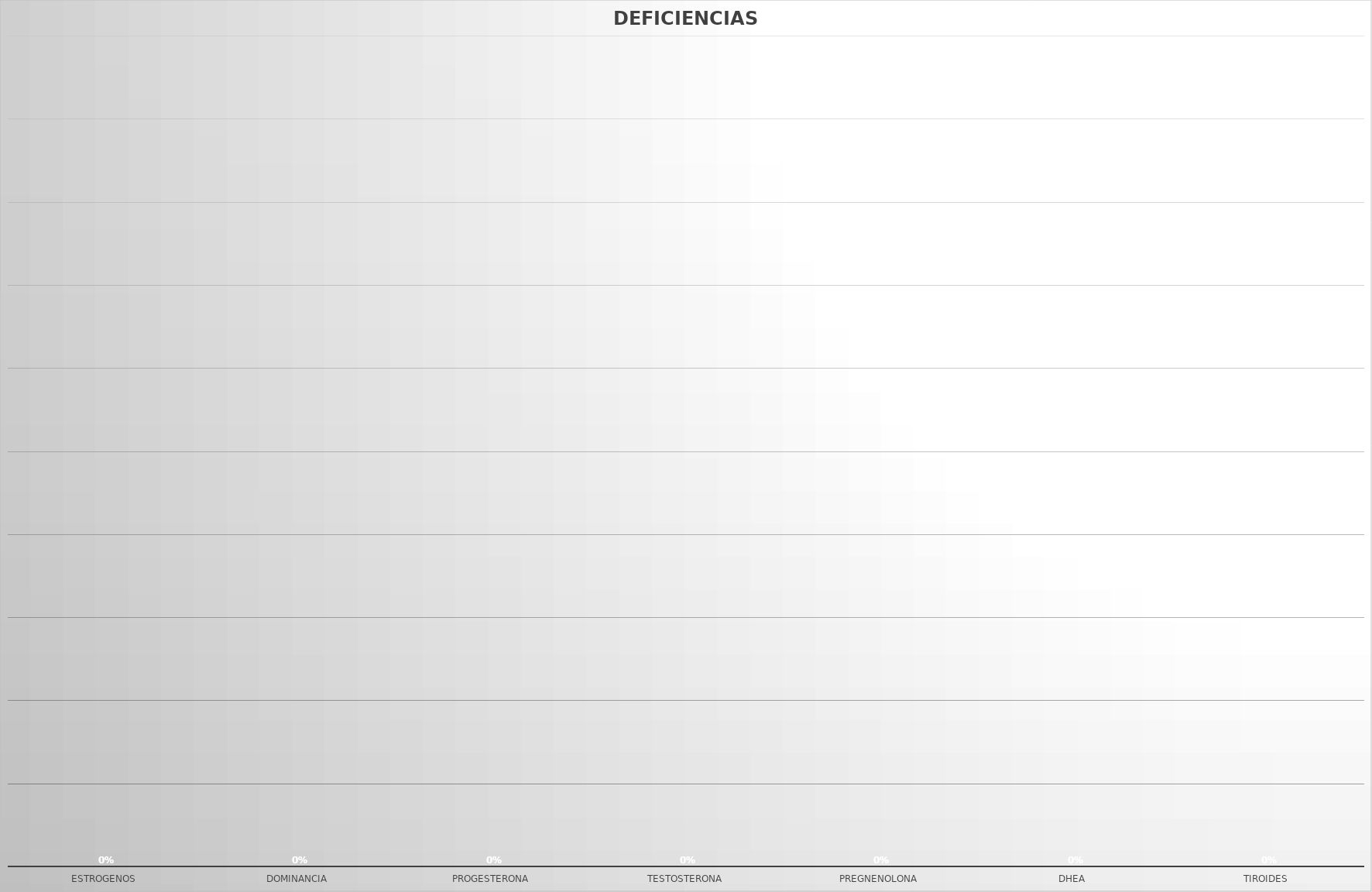
| Category | Series 0 |
|---|---|
| ESTROGENOS | 0 |
| DOMINANCIA | 0 |
| PROGESTERONA | 0 |
| TESTOSTERONA | 0 |
| PREGNENOLONA | 0 |
| DHEA | 0 |
| TIROIDES | 0 |